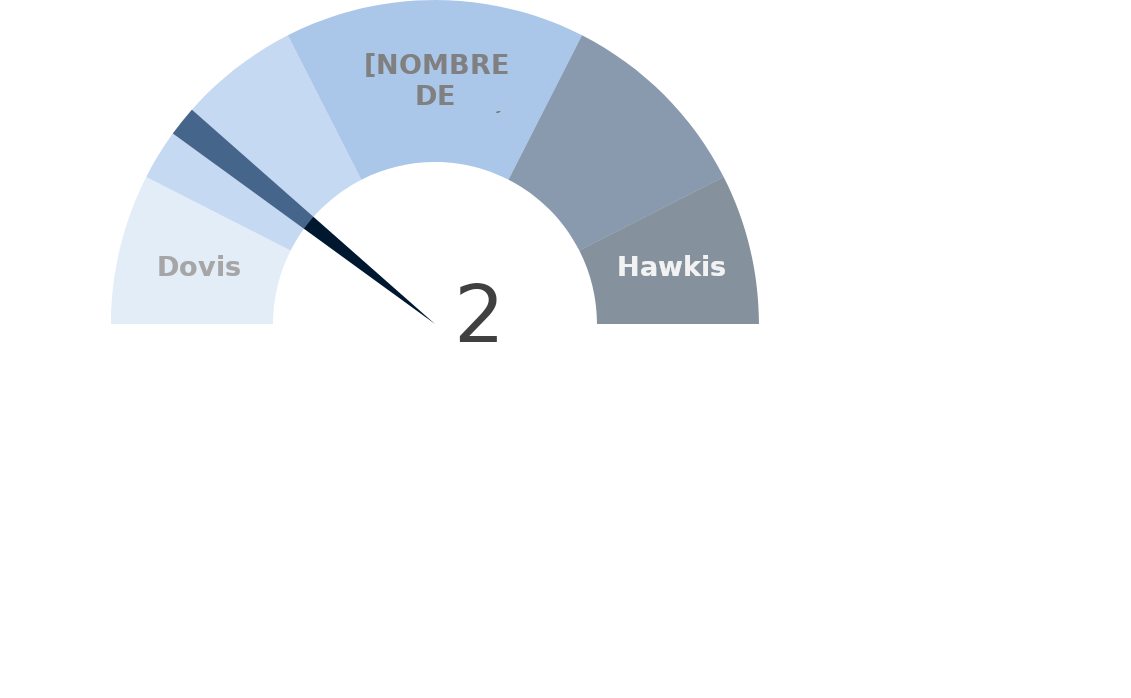
| Category | factor |
|---|---|
| 0 | 2 |
| 1 | 0.3 |
| 2 | 17.7 |